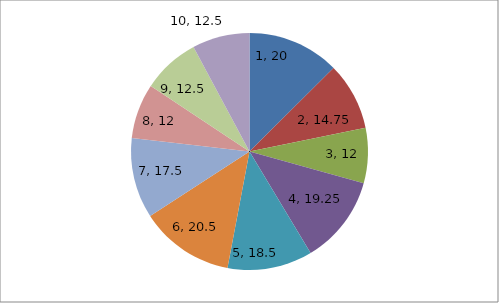
| Category | prom |
|---|---|
| 0 | 20 |
| 1 | 14.75 |
| 2 | 12 |
| 3 | 19.25 |
| 4 | 18.5 |
| 5 | 20.5 |
| 6 | 17.5 |
| 7 | 12 |
| 8 | 12.5 |
| 9 | 12.5 |